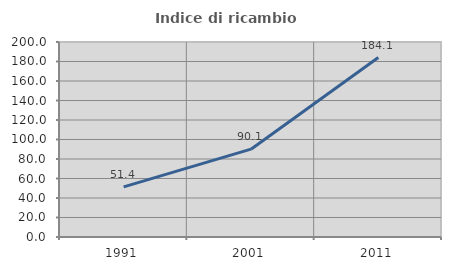
| Category | Indice di ricambio occupazionale  |
|---|---|
| 1991.0 | 51.443 |
| 2001.0 | 90.081 |
| 2011.0 | 184.091 |